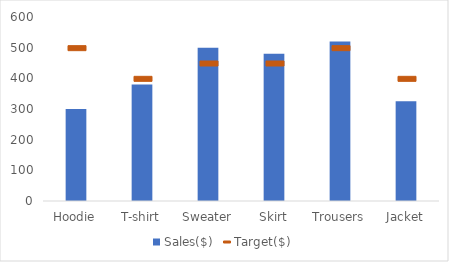
| Category | Sales($) |
|---|---|
| Hoodie | 300 |
| T-shirt | 380 |
| Sweater | 500 |
| Skirt | 480 |
| Trousers | 520 |
| Jacket | 325 |